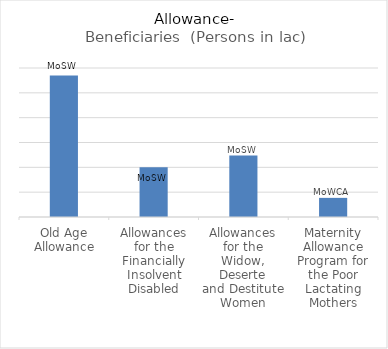
| Category | Beneficiaries  (Persons in lac) |
|---|---|
| Old Age Allowance | 57.01 |
| Allowances for the Financially
Insolvent Disabled | 20.08 |
| Allowances for the Widow, Deserte
and Destitute Women | 24.75 |
| Maternity Allowance Program for
the Poor Lactating Mothers | 7.7 |